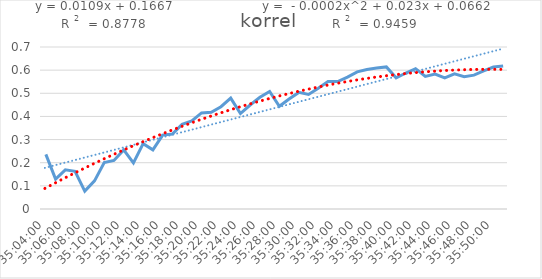
| Category | korrel |
|---|---|
| 1900-01-01 11:04:00 | 0.236 |
| 1900-01-01 11:05:00 | 0.129 |
| 1900-01-01 11:06:00 | 0.169 |
| 1900-01-01 11:07:00 | 0.163 |
| 1900-01-01 11:08:00 | 0.077 |
| 1900-01-01 11:09:00 | 0.121 |
| 1900-01-01 11:10:00 | 0.201 |
| 1900-01-01 11:11:00 | 0.21 |
| 1900-01-01 11:12:00 | 0.255 |
| 1900-01-01 11:13:00 | 0.199 |
| 1900-01-01 11:14:00 | 0.282 |
| 1900-01-01 11:15:00 | 0.255 |
| 1900-01-01 11:16:00 | 0.32 |
| 1900-01-01 11:17:00 | 0.324 |
| 1900-01-01 11:18:00 | 0.366 |
| 1900-01-01 11:19:00 | 0.38 |
| 1900-01-01 11:20:00 | 0.415 |
| 1900-01-01 11:21:00 | 0.418 |
| 1900-01-01 11:22:00 | 0.442 |
| 1900-01-01 11:23:00 | 0.479 |
| 1900-01-01 11:24:00 | 0.412 |
| 1900-01-01 11:25:00 | 0.449 |
| 1900-01-01 11:26:00 | 0.483 |
| 1900-01-01 11:27:00 | 0.508 |
| 1900-01-01 11:28:00 | 0.444 |
| 1900-01-01 11:29:00 | 0.475 |
| 1900-01-01 11:30:00 | 0.504 |
| 1900-01-01 11:31:00 | 0.495 |
| 1900-01-01 11:32:00 | 0.522 |
| 1900-01-01 11:33:00 | 0.551 |
| 1900-01-01 11:34:00 | 0.551 |
| 1900-01-01 11:35:00 | 0.57 |
| 1900-01-01 11:36:00 | 0.593 |
| 1900-01-01 11:37:00 | 0.603 |
| 1900-01-01 11:38:00 | 0.609 |
| 1900-01-01 11:39:00 | 0.614 |
| 1900-01-01 11:40:00 | 0.567 |
| 1900-01-01 11:41:00 | 0.588 |
| 1900-01-01 11:42:00 | 0.606 |
| 1900-01-01 11:43:00 | 0.573 |
| 1900-01-01 11:44:00 | 0.583 |
| 1900-01-01 11:45:00 | 0.566 |
| 1900-01-01 11:46:00 | 0.584 |
| 1900-01-01 11:47:00 | 0.571 |
| 1900-01-01 11:48:00 | 0.578 |
| 1900-01-01 11:49:00 | 0.597 |
| 1900-01-01 11:50:00 | 0.613 |
| 1900-01-01 11:51:00 | 0.618 |